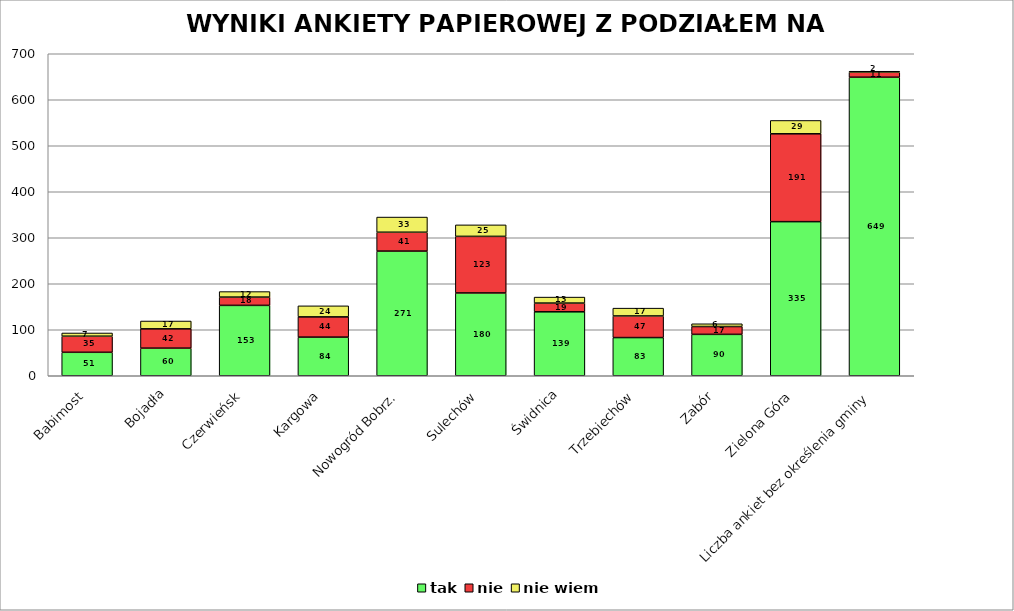
| Category | tak | nie | nie wiem |
|---|---|---|---|
| Babimost | 51 | 35 | 7 |
| Bojadła | 60 | 42 | 17 |
| Czerwieńsk | 153 | 18 | 12 |
| Kargowa | 84 | 44 | 24 |
| Nowogród Bobrz. | 271 | 41 | 33 |
| Sulechów | 180 | 123 | 25 |
| Świdnica | 139 | 19 | 13 |
| Trzebiechów | 83 | 47 | 17 |
| Zabór | 90 | 17 | 6 |
| Zielona Góra | 335 | 191 | 29 |
| Liczba ankiet bez określenia gminy | 649 | 11 | 2 |